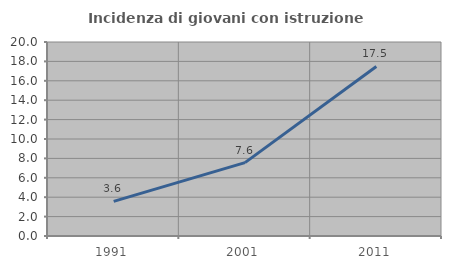
| Category | Incidenza di giovani con istruzione universitaria |
|---|---|
| 1991.0 | 3.565 |
| 2001.0 | 7.563 |
| 2011.0 | 17.481 |